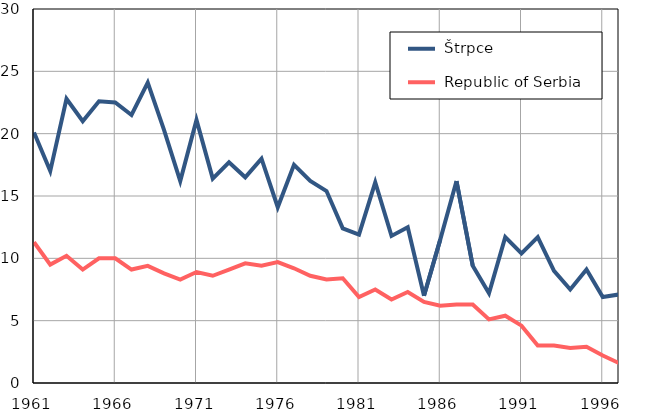
| Category |  Štrpce |  Republic of Serbia |
|---|---|---|
| 1961.0 | 20.1 | 11.3 |
| 1962.0 | 17 | 9.5 |
| 1963.0 | 22.8 | 10.2 |
| 1964.0 | 21 | 9.1 |
| 1965.0 | 22.6 | 10 |
| 1966.0 | 22.5 | 10 |
| 1967.0 | 21.5 | 9.1 |
| 1968.0 | 24.1 | 9.4 |
| 1969.0 | 20.3 | 8.8 |
| 1970.0 | 16.2 | 8.3 |
| 1971.0 | 21.1 | 8.9 |
| 1972.0 | 16.4 | 8.6 |
| 1973.0 | 17.7 | 9.1 |
| 1974.0 | 16.5 | 9.6 |
| 1975.0 | 18 | 9.4 |
| 1976.0 | 14.1 | 9.7 |
| 1977.0 | 17.5 | 9.2 |
| 1978.0 | 16.2 | 8.6 |
| 1979.0 | 15.4 | 8.3 |
| 1980.0 | 12.4 | 8.4 |
| 1981.0 | 11.9 | 6.9 |
| 1982.0 | 16.1 | 7.5 |
| 1983.0 | 11.8 | 6.7 |
| 1984.0 | 12.5 | 7.3 |
| 1985.0 | 7 | 6.5 |
| 1986.0 | 11.5 | 6.2 |
| 1987.0 | 16.2 | 6.3 |
| 1988.0 | 9.4 | 6.3 |
| 1989.0 | 7.2 | 5.1 |
| 1990.0 | 11.7 | 5.4 |
| 1991.0 | 10.4 | 4.6 |
| 1992.0 | 11.7 | 3 |
| 1993.0 | 9 | 3 |
| 1994.0 | 7.5 | 2.8 |
| 1995.0 | 9.1 | 2.9 |
| 1996.0 | 6.9 | 2.2 |
| 1997.0 | 7.1 | 1.6 |